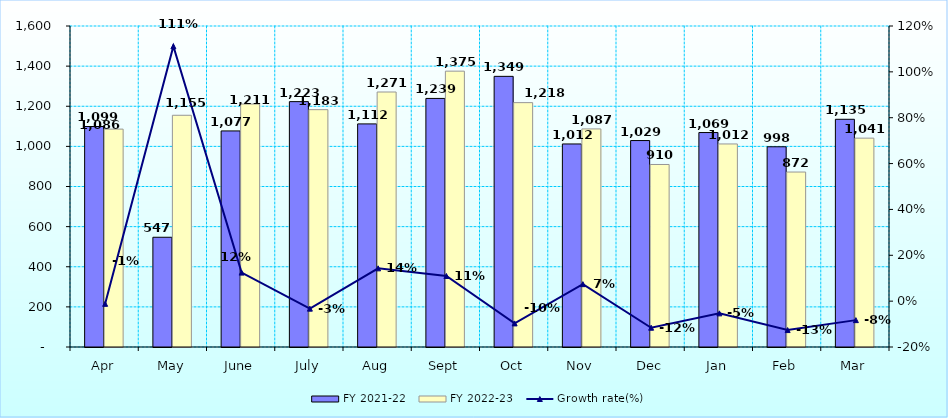
| Category | FY 2021-22 | FY 2022-23 |
|---|---|---|
| Apr | 1099 | 1086 |
| May | 547 | 1155 |
| June | 1077 | 1211 |
| July | 1223 | 1183 |
| Aug | 1112 | 1271 |
| Sept | 1239 | 1375 |
| Oct | 1349 | 1218 |
| Nov | 1012 | 1087 |
| Dec | 1029 | 909.694 |
| Jan | 1069 | 1012 |
| Feb | 998 | 872.062 |
| Mar | 1135 | 1041 |